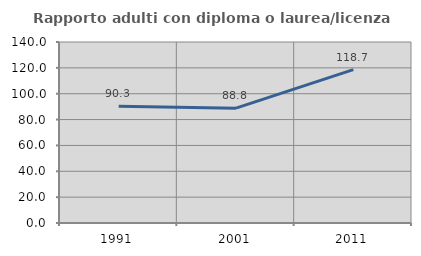
| Category | Rapporto adulti con diploma o laurea/licenza media  |
|---|---|
| 1991.0 | 90.303 |
| 2001.0 | 88.846 |
| 2011.0 | 118.689 |